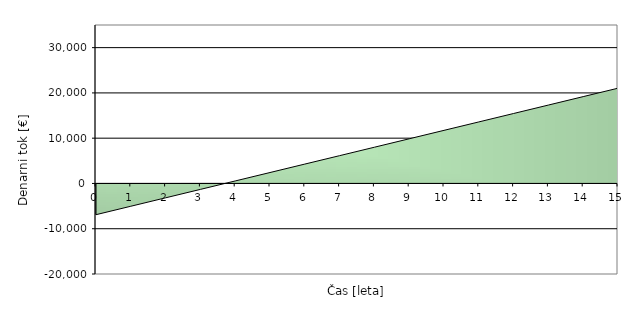
| Category | Series 0 |
|---|---|
| 0.0 | -6900 |
| 1.0 | -5037.198 |
| 2.0 | -3174.396 |
| 3.0 | -1311.594 |
| 4.0 | 551.207 |
| 5.0 | 2414.009 |
| 6.0 | 4276.811 |
| 7.0 | 6139.613 |
| 8.0 | 8002.415 |
| 9.0 | 9865.217 |
| 10.0 | 11728.019 |
| 11.0 | 13590.821 |
| 12.0 | 15453.622 |
| 13.0 | 17316.424 |
| 14.0 | 19179.226 |
| 15.0 | 21042.028 |